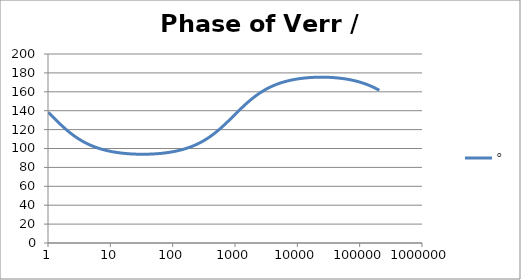
| Category | ° |
|---|---|
| 1.0 | 138.487 |
| 1.0634378492473788 | 136.736 |
| 1.1309000592118907 | 134.979 |
| 1.2026419266820265 | 133.223 |
| 1.278934943925458 | 131.474 |
| 1.3600678260954062 | 129.738 |
| 1.4463476038134566 | 128.023 |
| 1.5381007850634825 | 126.333 |
| 1.6356745907936145 | 124.675 |
| 1.739438268902148 | 123.053 |
| 1.849784491579884 | 121.472 |
| 1.967130841296868 | 119.935 |
| 2.091921391056928 | 118.447 |
| 2.2246283849001642 | 117.008 |
| 2.365754025012901 | 115.621 |
| 2.5158323722080485 | 114.288 |
| 2.6754313669678584 | 113.01 |
| 2.8451549786972743 | 111.786 |
| 3.025645491321301 | 110.616 |
| 3.2175859338757533 | 109.501 |
| 3.42170266528945 | 108.44 |
| 3.6387681231394358 | 107.431 |
| 3.8696037467813236 | 106.473 |
| 4.115083085916729 | 105.566 |
| 4.376135106361553 | 104.707 |
| 4.653747705525078 | 103.894 |
| 4.948971450903514 | 103.127 |
| 5.262923555735513 | 102.404 |
| 5.596792106864742 | 101.721 |
| 5.951840560808945 | 101.079 |
| 6.329412525049976 | 100.475 |
| 6.730936842638569 | 99.908 |
| 7.157932999355504 | 99.376 |
| 7.612016873891456 | 98.877 |
| 8.094906852805886 | 98.409 |
| 8.608430333405762 | 97.972 |
| 9.154530639152917 | 97.564 |
| 9.735274373770007 | 97.183 |
| 10.352859241875105 | 96.829 |
| 11.009622365740512 | 96.5 |
| 11.708049129648925 | 96.195 |
| 12.4507825853165 | 95.913 |
| 13.240633453975693 | 95.652 |
| 14.080590762968805 | 95.413 |
| 14.973833157104059 | 95.194 |
| 15.923740927579823 | 94.994 |
| 16.93390880399795 | 94.813 |
| 18.008159557874837 | 94.65 |
| 19.150558469130036 | 94.505 |
| 20.365428710297824 | 94.376 |
| 21.65736770667993 | 94.264 |
| 23.031264534351347 | 94.168 |
| 24.492318421858034 | 94.088 |
| 26.046058425622668 | 94.023 |
| 27.698364353515743 | 93.973 |
| 29.45548901577305 | 93.939 |
| 31.32408188746347 | 93.919 |
| 33.311214272052936 | 93.914 |
| 35.42440606129053 | 93.923 |
| 37.67165419268462 | 93.948 |
| 40.06146291225952 | 93.987 |
| 42.60287595711691 | 94.041 |
| 45.30551077958928 | 94.111 |
| 48.17959494250036 | 94.196 |
| 51.23600482326248 | 94.297 |
| 54.486306773278585 | 94.414 |
| 57.94280088840825 | 94.547 |
| 61.61856755613799 | 94.698 |
| 65.52751695560372 | 94.866 |
| 69.68444169778837 | 95.053 |
| 74.10507280510043 | 95.259 |
| 78.80613924217637 | 95.484 |
| 83.8054312231895 | 95.729 |
| 89.12186753523771 | 95.996 |
| 94.77556713258299 | 96.285 |
| 100.78792527267464 | 96.597 |
| 107.18169448207877 | 96.934 |
| 113.98107065871142 | 97.296 |
| 121.21178463621371 | 97.685 |
| 128.90119955697148 | 98.102 |
| 137.07841442227294 | 98.548 |
| 145.77437421146283 | 99.025 |
| 155.02198698682062 | 99.534 |
| 164.85624842731968 | 100.077 |
| 175.3143742625403 | 100.655 |
| 186.43594110790573 | 101.27 |
| 198.26303623420247 | 101.924 |
| 210.84041683815525 | 102.618 |
| 224.21567941678887 | 103.355 |
| 238.43943988652958 | 104.135 |
| 253.56552512868072 | 104.962 |
| 269.65117668612646 | 105.835 |
| 286.75726738211927 | 106.757 |
| 304.9485316808965 | 107.73 |
| 324.2938106618788 | 108.754 |
| 344.8663125345048 | 109.831 |
| 366.7438896795682 | 110.962 |
| 390.00933326545766 | 112.147 |
| 414.7506865542229 | 113.387 |
| 441.06157808309626 | 114.681 |
| 469.0415759823428 | 116.029 |
| 498.7965647702637 | 117.43 |
| 530.4391460512702 | 118.883 |
| 564.089064633379 | 120.385 |
| 599.8736616776864 | 121.933 |
| 637.9283565946681 | 123.524 |
| 678.3971595109495 | 125.155 |
| 721.4332162458546 | 126.82 |
| 767.1993878601115 | 128.514 |
| 815.868866969862 | 130.233 |
| 867.6258331583267 | 131.969 |
| 922.6661499653554 | 133.716 |
| 981.1981060925172 | 135.468 |
| 1043.443203628628 | 137.218 |
| 1109.6369962786232 | 138.959 |
| 1180.0299807678607 | 140.686 |
| 1254.8885447951977 | 142.391 |
| 1334.4959751221782 | 144.069 |
| 1419.1535296132129 | 145.714 |
| 1509.1815772837017 | 147.322 |
| 1604.9208106703452 | 148.888 |
| 1706.7335351116335 | 150.409 |
| 1815.0050398174897 | 151.882 |
| 1930.1450559166665 | 153.304 |
| 2052.58930699948 | 154.674 |
| 2182.801158023697 | 155.989 |
| 2321.2733688234066 | 157.25 |
| 2468.5299588567814 | 158.457 |
| 2625.128190249376 | 159.608 |
| 2791.6606766374607 | 160.705 |
| 2968.757625791824 | 161.749 |
| 3157.08922450881 | 162.74 |
| 3357.3681747937244 | 163.68 |
| 3570.352390934236 | 164.57 |
| 3796.8478676703417 | 165.412 |
| 4037.7117303148448 | 166.207 |
| 4293.8554783669315 | 166.958 |
| 4566.248434893605 | 167.664 |
| 4855.9214147324665 | 168.329 |
| 5163.970625397384 | 168.955 |
| 5491.561815449236 | 169.541 |
| 5839.934686030357 | 170.092 |
| 6210.40758225729 | 170.607 |
| 6604.382482225307 | 171.089 |
| 7023.350302504747 | 171.539 |
| 7468.896540206577 | 171.958 |
| 7942.707272968458 | 172.348 |
| 8446.575539567106 | 172.71 |
| 8982.408125302747 | 173.046 |
| 9552.232777834151 | 173.355 |
| 10158.205880770249 | 173.641 |
| 10802.620614058389 | 173.902 |
| 11487.915632049675 | 174.141 |
| 12216.684292082227 | 174.358 |
| 12991.684468506162 | 174.555 |
| 13815.848989288772 | 174.73 |
| 14692.296734695852 | 174.886 |
| 15624.344440049217 | 175.023 |
| 16615.519247226184 | 175.141 |
| 17669.572052398642 | 175.241 |
| 18790.49170052441 | 175.323 |
| 19982.5200803064 | 175.387 |
| 21250.168176743602 | 175.435 |
| 22598.233142021272 | 175.464 |
| 24031.816449341983 | 175.477 |
| 25556.34319839602 | 175.473 |
| 27177.582645530147 | 175.452 |
| 28901.67003630542 | 175.413 |
| 30735.129823066054 | 175.358 |
| 32684.900355380338 | 175.284 |
| 34758.3601367905 | 175.194 |
| 36963.35574723439 | 175.085 |
| 39308.23153680468 | 174.958 |
| 41801.861203217486 | 174.812 |
| 44453.68137248706 | 174.646 |
| 47273.727309885995 | 174.461 |
| 50272.670896332245 | 174.255 |
| 53461.86101391677 | 174.028 |
| 56853.36649340195 | 173.779 |
| 60460.02178621637 | 173.507 |
| 64295.47553378361 | 173.211 |
| 68374.24221798431 | 172.891 |
| 72711.75708821259 | 172.545 |
| 77324.43457288652 | 172.172 |
| 82229.73039646025 | 171.772 |
| 87446.2076370035 | 171.342 |
| 92993.60697433475 | 170.882 |
| 98892.92139454243 | 170.39 |
| 105166.47563360249 | 169.866 |
| 111838.01066072512 | 169.308 |
| 118932.77352114675 | 168.714 |
| 126477.61287835392 | 168.083 |
| 134501.0806172993 | 167.414 |
| 143033.53989310883 | 166.707 |
| 152107.28003416685 | 165.959 |
| 161756.63873440344 | 165.169 |
| 172018.1319971993 | 164.338 |
| 182930.592322653 | 163.464 |
| 194535.31566115122 | 162.547 |
| 206876.217689355 | 161.586 |